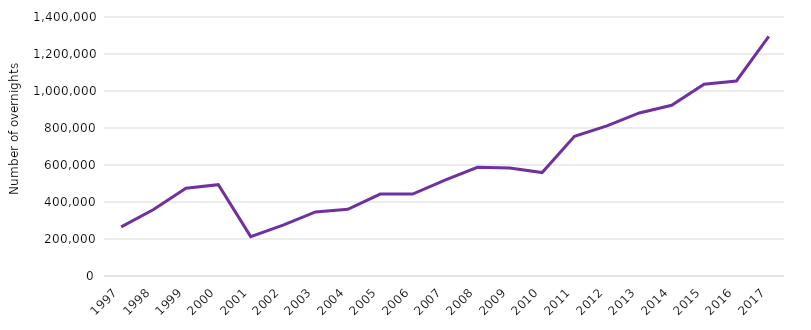
| Category | Total |
|---|---|
| 1997.0 | 265524 |
| 1998.0 | 359538 |
| 1999.0 | 474394 |
| 2000.0 | 493867 |
| 2001.0 | 212751 |
| 2002.0 | 274720 |
| 2003.0 | 346200 |
| 2004.0 | 360589 |
| 2005.0 | 442988 |
| 2006.0 | 442845 |
| 2007.0 | 518088 |
| 2008.0 | 587447 |
| 2009.0 | 583796 |
| 2010.0 | 559032 |
| 2011.0 | 755166 |
| 2012.0 | 811746 |
| 2013.0 | 881375 |
| 2014.0 | 922513 |
| 2015.0 | 1036383 |
| 2016.0 | 1054017 |
| 2017.0 | 1294692 |